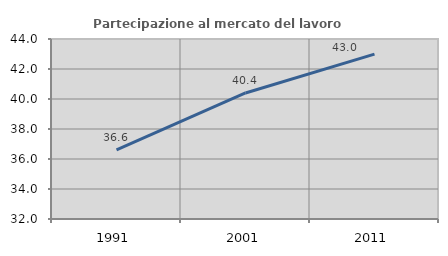
| Category | Partecipazione al mercato del lavoro  femminile |
|---|---|
| 1991.0 | 36.607 |
| 2001.0 | 40.403 |
| 2011.0 | 42.992 |